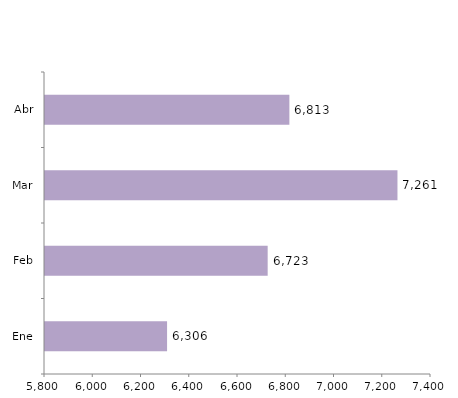
| Category | Series 0 |
|---|---|
| Ene | 6306 |
| Feb | 6723 |
| Mar | 7261 |
| Abr | 6813 |